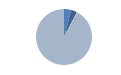
| Category | Series 0 |
|---|---|
| ARRASTRE | 115 |
| CERCO | 66 |
| PALANGRE | 26 |
| REDES DE ENMALLE | 6 |
| ARTES MENORES | 2537 |
| SIN TIPO ASIGNADO | 0 |